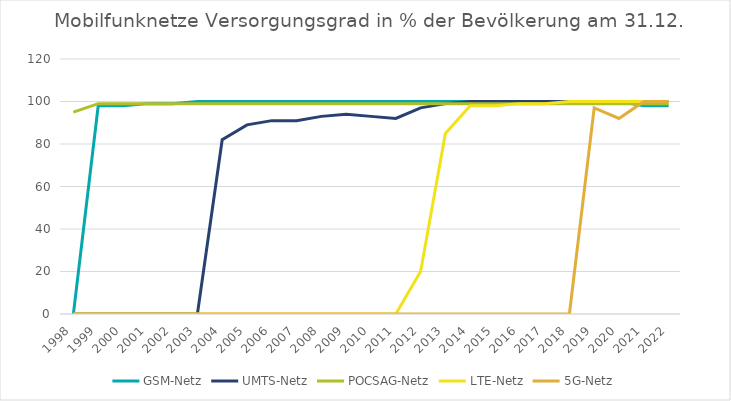
| Category | GSM-Netz | UMTS-Netz | POCSAG-Netz | LTE-Netz | 5G-Netz |
|---|---|---|---|---|---|
| 1998.0 | 0 | 0 | 95 | 0 | 0 |
| 1999.0 | 98 | 0 | 99 | 0 | 0 |
| 2000.0 | 98 | 0 | 99 | 0 | 0 |
| 2001.0 | 99 | 0 | 99 | 0 | 0 |
| 2002.0 | 99 | 0 | 99 | 0 | 0 |
| 2003.0 | 100 | 0 | 99 | 0 | 0 |
| 2004.0 | 100 | 82 | 99 | 0 | 0 |
| 2005.0 | 100 | 89 | 99 | 0 | 0 |
| 2006.0 | 100 | 91 | 99 | 0 | 0 |
| 2007.0 | 100 | 91 | 99 | 0 | 0 |
| 2008.0 | 100 | 93 | 99 | 0 | 0 |
| 2009.0 | 100 | 94 | 99 | 0 | 0 |
| 2010.0 | 100 | 93 | 99 | 0 | 0 |
| 2011.0 | 100 | 92 | 99 | 0 | 0 |
| 2012.0 | 100 | 97 | 99 | 20 | 0 |
| 2013.0 | 100 | 99 | 99 | 85 | 0 |
| 2014.0 | 100 | 100 | 99 | 98 | 0 |
| 2015.0 | 100 | 100 | 99 | 98 | 0 |
| 2016.0 | 100 | 100 | 99 | 99 | 0 |
| 2017.0 | 100 | 100 | 99 | 99 | 0 |
| 2018.0 | 100 | 100 | 99 | 100 | 0 |
| 2019.0 | 100 | 100 | 99 | 100 | 97 |
| 2020.0 | 100 | 100 | 99 | 100 | 92 |
| 2021.0 | 98 | 100 | 99 | 100 | 100 |
| 2022.0 | 98 | 100 | 99 | 100 | 100 |